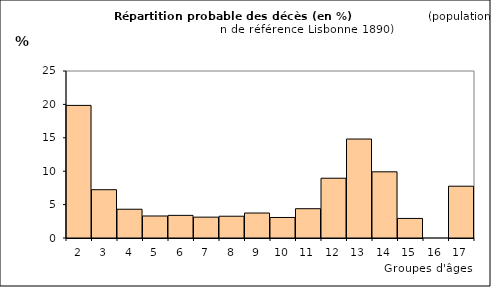
| Category | Series 0 |
|---|---|
| 2.0 | 19.851 |
| 3.0 | 7.228 |
| 4.0 | 4.305 |
| 5.0 | 3.294 |
| 6.0 | 3.389 |
| 7.0 | 3.121 |
| 8.0 | 3.26 |
| 9.0 | 3.739 |
| 10.0 | 3.073 |
| 11.0 | 4.385 |
| 12.0 | 8.948 |
| 13.0 | 14.816 |
| 14.0 | 9.908 |
| 15.0 | 2.93 |
| 16.0 | 0 |
| 17.0 | 7.753 |